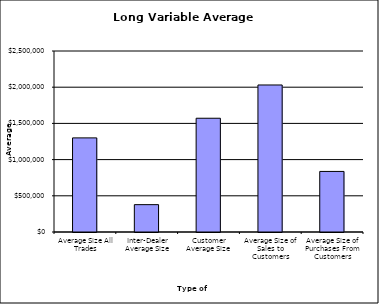
| Category | Security Type |
|---|---|
| Average Size All Trades | 1299992.318 |
| Inter-Dealer Average Size | 377763.419 |
| Customer Average Size | 1571267.836 |
| Average Size of Sales to Customers | 2030788.973 |
| Average Size of Purchases From Customers | 836592.705 |